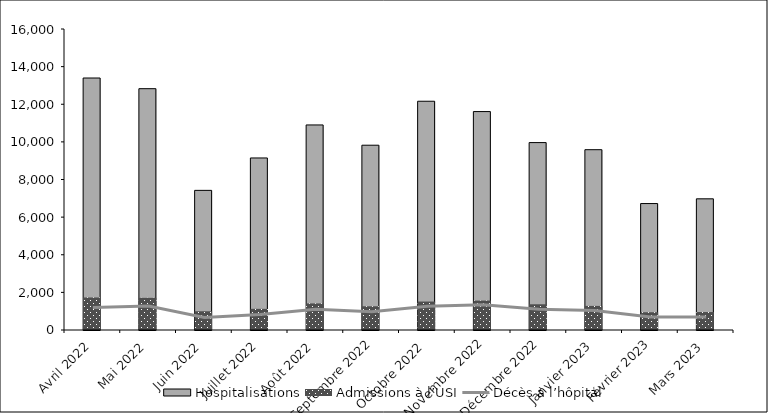
| Category | Hospitalisations | Admissions à l’USI |
|---|---|---|
| Avril 2022 | 13395 | 1729 |
| Mai 2022 | 12828 | 1709 |
| Juin 2022 | 7422 | 996 |
| Juillet 2022 | 9145 | 1125 |
| Août 2022 | 10900 | 1413 |
| Septembre 2022 | 9823 | 1261 |
| Octobre 2022 | 12160 | 1513 |
| Novembre 2022 | 11611 | 1563 |
| Décembre 2022 | 9962 | 1368 |
| Janvier 2023 | 9584 | 1281 |
| Février 2023 | 6721 | 944 |
| Mars 2023 | 6973 | 954 |